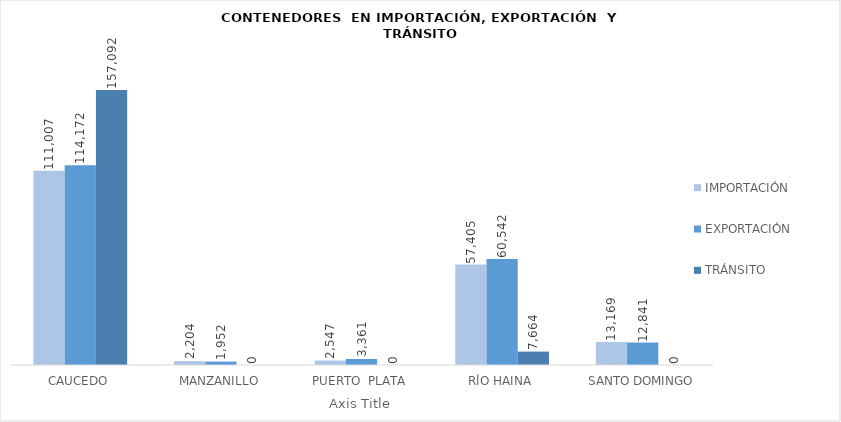
| Category | IMPORTACIÓN  | EXPORTACIÓN  | TRÁNSITO |
|---|---|---|---|
| CAUCEDO | 111007 | 114171.75 | 157092 |
| MANZANILLO | 2204 | 1952 | 0 |
| PUERTO  PLATA | 2546.5 | 3361 | 0 |
| RÍO HAINA | 57405.25 | 60541.75 | 7664 |
| SANTO DOMINGO | 13168.75 | 12841 | 0 |